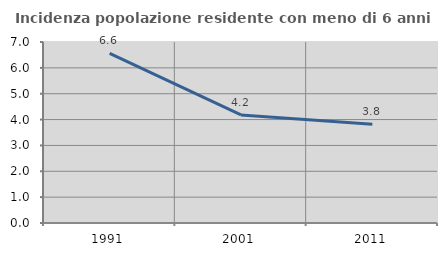
| Category | Incidenza popolazione residente con meno di 6 anni |
|---|---|
| 1991.0 | 6.563 |
| 2001.0 | 4.179 |
| 2011.0 | 3.815 |